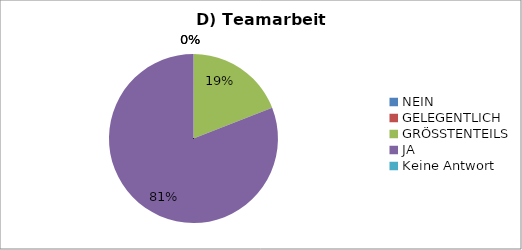
| Category | Series 0 |
|---|---|
| NEIN | 0 |
| GELEGENTLICH | 0 |
| GRÖSSTENTEILS | 4 |
| JA | 17 |
| Keine Antwort | 0 |